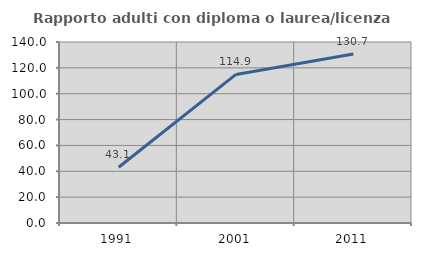
| Category | Rapporto adulti con diploma o laurea/licenza media  |
|---|---|
| 1991.0 | 43.111 |
| 2001.0 | 114.932 |
| 2011.0 | 130.738 |